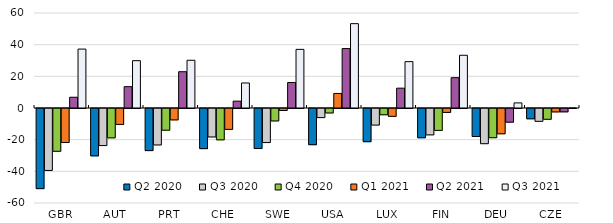
| Category | Q2 2020 | Q3 2020 | Q4 2020 | Q1 2021 | Q2 2021 | Q3 2021 |
|---|---|---|---|---|---|---|
| GBR | -50.601 | -39.121 | -27.02 | -21.467 | 6.797 | 37.215 |
| AUT | -29.892 | -23.412 | -18.538 | -10.064 | 13.472 | 29.898 |
| PRT | -26.578 | -23.024 | -13.701 | -7.194 | 22.921 | 30.155 |
| CHE | -25.34 | -17.973 | -19.791 | -13.184 | 4.324 | 15.8 |
| SWE | -25.277 | -21.504 | -7.861 | -1.262 | 16.089 | 37.033 |
| USA | -22.854 | -5.747 | -2.831 | 9.188 | 37.532 | 53.276 |
| LUX | -20.953 | -10.476 | -3.954 | -4.958 | 12.527 | 29.283 |
| FIN | -18.464 | -16.666 | -13.831 | -2.46 | 19.148 | 33.303 |
| DEU | -17.671 | -22.227 | -18.454 | -15.969 | -8.606 | 3.221 |
| CZE | -6.493 | -8.109 | -6.812 | -2.153 | -2.109 | 0.027 |